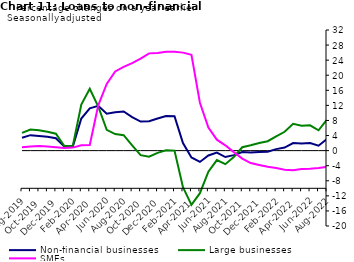
| Category | zero | Non-financial businesses | Large businesses | SMEs |
|---|---|---|---|---|
| Aug-2019 | 0 | 3.4 | 4.7 | 0.9 |
| Sep-2019 | 0 | 4.1 | 5.6 | 1.1 |
| Oct-2019 | 0 | 3.9 | 5.4 | 1.2 |
| Nov-2019 | 0 | 3.7 | 5 | 1.1 |
| Dec-2019 | 0 | 3.3 | 4.5 | 0.9 |
| Jan-2020 | 0 | 1.1 | 1.2 | 0.7 |
| Feb-2020 | 0 | 1.1 | 1.3 | 0.8 |
| Mar-2020 | 0 | 8.5 | 12.2 | 1.4 |
| Apr-2020 | 0 | 11.2 | 16.4 | 1.5 |
| May-2020 | 0 | 11.9 | 11.7 | 12 |
| Jun-2020 | 0 | 9.8 | 5.5 | 17.7 |
| Jul-2020 | 0 | 10.2 | 4.4 | 21 |
| Aug-2020 | 0 | 10.4 | 4.1 | 22.2 |
| Sep-2020 | 0 | 8.9 | 1.4 | 23.2 |
| Oct-2020 | 0 | 7.7 | -1.2 | 24.4 |
| Nov-2020 | 0 | 7.8 | -1.6 | 25.8 |
| Dec-2020 | 0 | 8.5 | -0.6 | 25.9 |
| Jan-2021 | 0 | 9.2 | 0.1 | 26.2 |
| Feb-2021 | 0 | 9.1 | 0 | 26.2 |
| Mar-2021 | 0 | 2 | -9.7 | 26 |
| Apr-2021 | 0 | -1.8 | -14.4 | 25.4 |
| May-2021 | 0 | -3 | -11.3 | 12.7 |
| Jun-2021 | 0 | -1.3 | -5.6 | 6.1 |
| Jul-2021 | 0 | -0.5 | -2.5 | 2.9 |
| Aug-2021 | 0 | -1.7 | -3.6 | 1.4 |
| Sep-2021 | 0 | -1.2 | -1.7 | -0.4 |
| Oct-2021 | 0 | -0.4 | 0.9 | -2.1 |
| Nov-2021 | 0 | -0.5 | 1.4 | -3.3 |
| Dec-2021 | 0 | -0.4 | 2 | -3.8 |
| Jan-2022 | 0 | -0.3 | 2.5 | -4.3 |
| Feb-2022 | 0 | 0.4 | 3.8 | -4.6 |
| Mar-2022 | 0 | 0.8 | 5 | -5.1 |
| Apr-2022 | 0 | 2 | 7.1 | -5.2 |
| May-2022 | 0 | 1.9 | 6.6 | -4.9 |
| Jun-2022 | 0 | 2 | 6.7 | -4.8 |
| Jul-2022 | 0 | 1.3 | 5.4 | -4.6 |
| Aug-2022 | 0 | 3.1 | 8.2 | -4.3 |